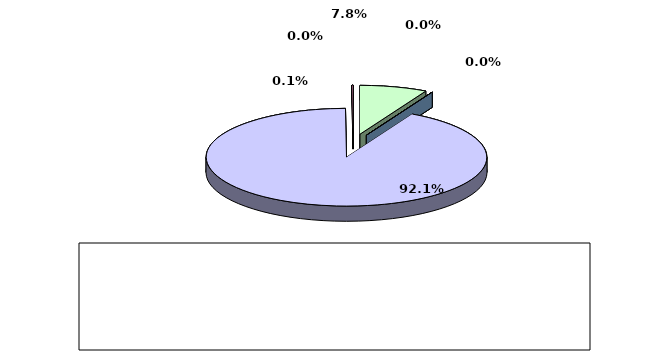
| Category | Series 0 |
|---|---|
| מזומנים ושווי מזומנים | 0.078 |
| אג"ח ממשלתיות סחירות | 0 |
| אג"ח קונצרני סחיר | 0 |
| ני"ע אחרים סחירים | 0.921 |
| פקדונות והלוואות | 0 |
| השקעות אחרות | 0.001 |